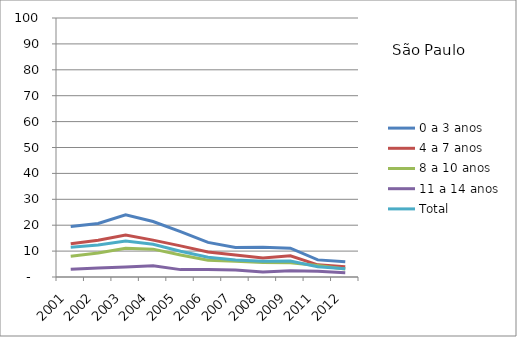
| Category | 0 a 3 anos | 4 a 7 anos | 8 a 10 anos | 11 a 14 anos | Total |
|---|---|---|---|---|---|
| 2001.0 | 19.48 | 12.8 | 8.03 | 2.95 | 11.52 |
| 2002.0 | 20.65 | 14.2 | 9.24 | 3.47 | 12.33 |
| 2003.0 | 23.99 | 16.19 | 11.12 | 3.9 | 13.88 |
| 2004.0 | 21.43 | 14.24 | 10.75 | 4.37 | 12.63 |
| 2005.0 | 17.54 | 12.02 | 8.5 | 2.85 | 9.93 |
| 2006.0 | 13.36 | 9.69 | 6.47 | 2.92 | 7.65 |
| 2007.0 | 11.4 | 8.5 | 6.07 | 2.67 | 6.61 |
| 2008.0 | 11.5 | 7.37 | 5.57 | 1.93 | 6.05 |
| 2009.0 | 11.12 | 8.16 | 5.46 | 2.37 | 6.21 |
| 2011.0 | 6.61 | 4.69 | 4.47 | 2.26 | 3.97 |
| 2012.0 | 5.85 | 3.95 | 3.06 | 1.65 | 3.17 |